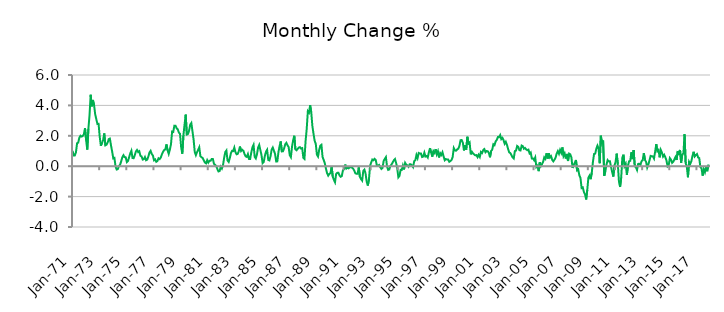
| Category | Series 0 |
|---|---|
| 1971-01-01 | 1.014 |
| 1971-02-01 | 0.711 |
| 1971-03-01 | 0.712 |
| 1971-04-01 | 0.919 |
| 1971-05-01 | 1.51 |
| 1971-06-01 | 1.551 |
| 1971-07-01 | 1.878 |
| 1971-08-01 | 2.005 |
| 1971-09-01 | 1.95 |
| 1971-10-01 | 1.987 |
| 1971-11-01 | 2.104 |
| 1971-12-01 | 2.509 |
| 1972-01-01 | 1.699 |
| 1972-02-01 | 1.094 |
| 1972-03-01 | 2.462 |
| 1972-04-01 | 3.36 |
| 1972-05-01 | 4.697 |
| 1972-06-01 | 3.937 |
| 1972-07-01 | 4.355 |
| 1972-08-01 | 4.026 |
| 1972-09-01 | 3.417 |
| 1972-10-01 | 3.088 |
| 1972-11-01 | 2.774 |
| 1972-12-01 | 2.784 |
| 1973-01-01 | 1.938 |
| 1973-02-01 | 1.343 |
| 1973-03-01 | 1.524 |
| 1973-04-01 | 1.712 |
| 1973-05-01 | 2.158 |
| 1973-06-01 | 1.373 |
| 1973-07-01 | 1.418 |
| 1973-08-01 | 1.551 |
| 1973-09-01 | 1.782 |
| 1973-10-01 | 1.816 |
| 1973-11-01 | 1.359 |
| 1973-12-01 | 0.961 |
| 1974-01-01 | 0.511 |
| 1974-02-01 | 0.548 |
| 1974-03-01 | -0.022 |
| 1974-04-01 | -0.216 |
| 1974-05-01 | -0.191 |
| 1974-06-01 | 0.007 |
| 1974-07-01 | 0.097 |
| 1974-08-01 | 0.326 |
| 1974-09-01 | 0.591 |
| 1974-10-01 | 0.722 |
| 1974-11-01 | 0.594 |
| 1974-12-01 | 0.583 |
| 1975-01-01 | 0.268 |
| 1975-02-01 | 0.337 |
| 1975-03-01 | 0.597 |
| 1975-04-01 | 0.845 |
| 1975-05-01 | 1.017 |
| 1975-06-01 | 0.539 |
| 1975-07-01 | 0.526 |
| 1975-08-01 | 0.722 |
| 1975-09-01 | 0.97 |
| 1975-10-01 | 1.067 |
| 1975-11-01 | 0.93 |
| 1975-12-01 | 0.985 |
| 1976-01-01 | 0.687 |
| 1976-02-01 | 0.643 |
| 1976-03-01 | 0.437 |
| 1976-04-01 | 0.463 |
| 1976-05-01 | 0.603 |
| 1976-06-01 | 0.392 |
| 1976-07-01 | 0.432 |
| 1976-08-01 | 0.636 |
| 1976-09-01 | 0.905 |
| 1976-10-01 | 1.011 |
| 1976-11-01 | 0.8 |
| 1976-12-01 | 0.709 |
| 1977-01-01 | 0.392 |
| 1977-02-01 | 0.448 |
| 1977-03-01 | 0.289 |
| 1977-04-01 | 0.338 |
| 1977-05-01 | 0.521 |
| 1977-06-01 | 0.47 |
| 1977-07-01 | 0.575 |
| 1977-08-01 | 0.784 |
| 1977-09-01 | 0.951 |
| 1977-10-01 | 1.061 |
| 1977-11-01 | 1.111 |
| 1977-12-01 | 1.434 |
| 1978-01-01 | 1.05 |
| 1978-02-01 | 0.811 |
| 1978-03-01 | 1.084 |
| 1978-04-01 | 1.443 |
| 1978-05-01 | 2.28 |
| 1978-06-01 | 2.255 |
| 1978-07-01 | 2.668 |
| 1978-08-01 | 2.665 |
| 1978-09-01 | 2.498 |
| 1978-10-01 | 2.424 |
| 1978-11-01 | 2.207 |
| 1978-12-01 | 2.133 |
| 1979-01-01 | 1.242 |
| 1979-02-01 | 0.823 |
| 1979-03-01 | 2.034 |
| 1979-04-01 | 2.732 |
| 1979-05-01 | 3.394 |
| 1979-06-01 | 2.083 |
| 1979-07-01 | 2.118 |
| 1979-08-01 | 2.335 |
| 1979-09-01 | 2.734 |
| 1979-10-01 | 2.841 |
| 1979-11-01 | 2.3 |
| 1979-12-01 | 1.747 |
| 1980-01-01 | 0.943 |
| 1980-02-01 | 0.726 |
| 1980-03-01 | 0.925 |
| 1980-04-01 | 1.073 |
| 1980-05-01 | 1.242 |
| 1980-06-01 | 0.656 |
| 1980-07-01 | 0.591 |
| 1980-08-01 | 0.543 |
| 1980-09-01 | 0.381 |
| 1980-10-01 | 0.243 |
| 1980-11-01 | 0.186 |
| 1980-12-01 | 0.395 |
| 1981-01-01 | 0.234 |
| 1981-02-01 | 0.354 |
| 1981-03-01 | 0.354 |
| 1981-04-01 | 0.474 |
| 1981-05-01 | 0.478 |
| 1981-06-01 | 0.161 |
| 1981-07-01 | 0.077 |
| 1981-08-01 | 0.019 |
| 1981-09-01 | -0.188 |
| 1981-10-01 | -0.344 |
| 1981-11-01 | -0.317 |
| 1981-12-01 | -0.035 |
| 1982-01-01 | -0.155 |
| 1982-02-01 | 0.068 |
| 1982-03-01 | 0.555 |
| 1982-04-01 | 0.929 |
| 1982-05-01 | 1.031 |
| 1982-06-01 | 0.372 |
| 1982-07-01 | 0.28 |
| 1982-08-01 | 0.532 |
| 1982-09-01 | 0.859 |
| 1982-10-01 | 1.012 |
| 1982-11-01 | 0.998 |
| 1982-12-01 | 1.225 |
| 1983-01-01 | 0.92 |
| 1983-02-01 | 0.783 |
| 1983-03-01 | 0.81 |
| 1983-04-01 | 0.995 |
| 1983-05-01 | 1.293 |
| 1983-06-01 | 1.001 |
| 1983-07-01 | 1.08 |
| 1983-08-01 | 1.015 |
| 1983-09-01 | 0.803 |
| 1983-10-01 | 0.652 |
| 1983-11-01 | 0.611 |
| 1983-12-01 | 0.798 |
| 1984-01-01 | 0.473 |
| 1984-02-01 | 0.478 |
| 1984-03-01 | 0.903 |
| 1984-04-01 | 1.241 |
| 1984-05-01 | 1.404 |
| 1984-06-01 | 0.614 |
| 1984-07-01 | 0.511 |
| 1984-08-01 | 0.774 |
| 1984-09-01 | 1.225 |
| 1984-10-01 | 1.401 |
| 1984-11-01 | 1.068 |
| 1984-12-01 | 0.734 |
| 1985-01-01 | 0.202 |
| 1985-02-01 | 0.279 |
| 1985-03-01 | 0.684 |
| 1985-04-01 | 0.954 |
| 1985-05-01 | 1.079 |
| 1985-06-01 | 0.413 |
| 1985-07-01 | 0.38 |
| 1985-08-01 | 0.656 |
| 1985-09-01 | 1.087 |
| 1985-10-01 | 1.228 |
| 1985-11-01 | 1.02 |
| 1985-12-01 | 0.807 |
| 1986-01-01 | 0.311 |
| 1986-02-01 | 0.317 |
| 1986-03-01 | 0.923 |
| 1986-04-01 | 1.322 |
| 1986-05-01 | 1.629 |
| 1986-06-01 | 0.97 |
| 1986-07-01 | 0.982 |
| 1986-08-01 | 1.161 |
| 1986-09-01 | 1.443 |
| 1986-10-01 | 1.536 |
| 1986-11-01 | 1.373 |
| 1986-12-01 | 1.263 |
| 1987-01-01 | 0.724 |
| 1987-02-01 | 0.595 |
| 1987-03-01 | 1.283 |
| 1987-04-01 | 1.705 |
| 1987-05-01 | 2.003 |
| 1987-06-01 | 1.108 |
| 1987-07-01 | 1.049 |
| 1987-08-01 | 1.142 |
| 1987-09-01 | 1.226 |
| 1987-10-01 | 1.253 |
| 1987-11-01 | 1.16 |
| 1987-12-01 | 1.188 |
| 1988-01-01 | 0.558 |
| 1988-02-01 | 0.478 |
| 1988-03-01 | 1.666 |
| 1988-04-01 | 2.466 |
| 1988-05-01 | 3.62 |
| 1988-06-01 | 3.526 |
| 1988-07-01 | 4.01 |
| 1988-08-01 | 3.546 |
| 1988-09-01 | 2.637 |
| 1988-10-01 | 2.133 |
| 1988-11-01 | 1.68 |
| 1988-12-01 | 1.467 |
| 1989-01-01 | 0.756 |
| 1989-02-01 | 0.634 |
| 1989-03-01 | 1.069 |
| 1989-04-01 | 1.347 |
| 1989-05-01 | 1.408 |
| 1989-06-01 | 0.607 |
| 1989-07-01 | 0.411 |
| 1989-08-01 | 0.192 |
| 1989-09-01 | -0.165 |
| 1989-10-01 | -0.462 |
| 1989-11-01 | -0.618 |
| 1989-12-01 | -0.507 |
| 1990-01-01 | -0.459 |
| 1990-02-01 | -0.019 |
| 1990-03-01 | -0.686 |
| 1990-04-01 | -0.897 |
| 1990-05-01 | -1.058 |
| 1990-06-01 | -0.51 |
| 1990-07-01 | -0.437 |
| 1990-08-01 | -0.428 |
| 1990-09-01 | -0.604 |
| 1990-10-01 | -0.695 |
| 1990-11-01 | -0.649 |
| 1990-12-01 | -0.278 |
| 1991-01-01 | -0.196 |
| 1991-02-01 | 0.105 |
| 1991-03-01 | -0.159 |
| 1991-04-01 | -0.105 |
| 1991-05-01 | -0.139 |
| 1991-06-01 | -0.062 |
| 1991-07-01 | -0.066 |
| 1991-08-01 | -0.093 |
| 1991-09-01 | -0.159 |
| 1991-10-01 | -0.285 |
| 1991-11-01 | -0.467 |
| 1991-12-01 | -0.497 |
| 1992-01-01 | -0.494 |
| 1992-02-01 | -0.076 |
| 1992-03-01 | -0.697 |
| 1992-04-01 | -0.848 |
| 1992-05-01 | -0.944 |
| 1992-06-01 | -0.312 |
| 1992-07-01 | -0.225 |
| 1992-08-01 | -0.473 |
| 1992-09-01 | -1.015 |
| 1992-10-01 | -1.272 |
| 1992-11-01 | -0.873 |
| 1992-12-01 | 0.026 |
| 1993-01-01 | 0.247 |
| 1993-02-01 | 0.437 |
| 1993-03-01 | 0.391 |
| 1993-04-01 | 0.487 |
| 1993-05-01 | 0.413 |
| 1993-06-01 | 0.047 |
| 1993-07-01 | 0.03 |
| 1993-08-01 | 0.082 |
| 1993-09-01 | -0.063 |
| 1993-10-01 | -0.18 |
| 1993-11-01 | -0.118 |
| 1993-12-01 | 0.35 |
| 1994-01-01 | 0.48 |
| 1994-02-01 | 0.595 |
| 1994-03-01 | -0.023 |
| 1994-04-01 | -0.241 |
| 1994-05-01 | -0.212 |
| 1994-06-01 | 0.019 |
| 1994-07-01 | 0.12 |
| 1994-08-01 | 0.247 |
| 1994-09-01 | 0.391 |
| 1994-10-01 | 0.472 |
| 1994-11-01 | 0.222 |
| 1994-12-01 | -0.131 |
| 1995-01-01 | -0.733 |
| 1995-02-01 | -0.635 |
| 1995-03-01 | -0.24 |
| 1995-04-01 | -0.251 |
| 1995-05-01 | 0.043 |
| 1995-06-01 | -0.212 |
| 1995-07-01 | 0.218 |
| 1995-08-01 | 0.097 |
| 1995-09-01 | 0.057 |
| 1995-10-01 | -0.036 |
| 1995-11-01 | 0.126 |
| 1995-12-01 | 0.123 |
| 1996-01-01 | 0.036 |
| 1996-02-01 | -0.061 |
| 1996-03-01 | 0.33 |
| 1996-04-01 | 0.389 |
| 1996-05-01 | 0.736 |
| 1996-06-01 | 0.535 |
| 1996-07-01 | 0.868 |
| 1996-08-01 | 0.833 |
| 1996-09-01 | 0.834 |
| 1996-10-01 | 0.603 |
| 1996-11-01 | 0.635 |
| 1996-12-01 | 0.892 |
| 1997-01-01 | 0.634 |
| 1997-02-01 | 0.672 |
| 1997-03-01 | 0.57 |
| 1997-04-01 | 0.919 |
| 1997-05-01 | 1.19 |
| 1997-06-01 | 0.893 |
| 1997-07-01 | 0.625 |
| 1997-08-01 | 0.99 |
| 1997-09-01 | 0.877 |
| 1997-10-01 | 1.126 |
| 1997-11-01 | 0.779 |
| 1997-12-01 | 0.981 |
| 1998-01-01 | 0.576 |
| 1998-02-01 | 0.861 |
| 1998-03-01 | 0.744 |
| 1998-04-01 | 0.917 |
| 1998-05-01 | 0.646 |
| 1998-06-01 | 0.394 |
| 1998-07-01 | 0.47 |
| 1998-08-01 | 0.438 |
| 1998-09-01 | 0.441 |
| 1998-10-01 | 0.291 |
| 1998-11-01 | 0.339 |
| 1998-12-01 | 0.406 |
| 1999-01-01 | 0.599 |
| 1999-02-01 | 1.189 |
| 1999-03-01 | 1.036 |
| 1999-04-01 | 1.017 |
| 1999-05-01 | 1.102 |
| 1999-06-01 | 1.154 |
| 1999-07-01 | 1.343 |
| 1999-08-01 | 1.715 |
| 1999-09-01 | 1.719 |
| 1999-10-01 | 1.552 |
| 1999-11-01 | 1.038 |
| 1999-12-01 | 1.38 |
| 2000-01-01 | 1.085 |
| 2000-02-01 | 1.936 |
| 2000-03-01 | 1.491 |
| 2000-04-01 | 1.566 |
| 2000-05-01 | 0.781 |
| 2000-06-01 | 0.949 |
| 2000-07-01 | 0.839 |
| 2000-08-01 | 0.775 |
| 2000-09-01 | 0.714 |
| 2000-10-01 | 0.729 |
| 2000-11-01 | 0.596 |
| 2000-12-01 | 0.754 |
| 2001-01-01 | 0.606 |
| 2001-02-01 | 0.935 |
| 2001-03-01 | 0.867 |
| 2001-04-01 | 1.055 |
| 2001-05-01 | 1.127 |
| 2001-06-01 | 0.924 |
| 2001-07-01 | 0.998 |
| 2001-08-01 | 0.985 |
| 2001-09-01 | 0.883 |
| 2001-10-01 | 0.588 |
| 2001-11-01 | 0.997 |
| 2001-12-01 | 1.094 |
| 2002-01-01 | 1.445 |
| 2002-02-01 | 1.384 |
| 2002-03-01 | 1.631 |
| 2002-04-01 | 1.728 |
| 2002-05-01 | 1.918 |
| 2002-06-01 | 1.906 |
| 2002-07-01 | 2.048 |
| 2002-08-01 | 1.783 |
| 2002-09-01 | 1.859 |
| 2002-10-01 | 1.71 |
| 2002-11-01 | 1.477 |
| 2002-12-01 | 1.602 |
| 2003-01-01 | 1.407 |
| 2003-02-01 | 1.139 |
| 2003-03-01 | 0.91 |
| 2003-04-01 | 0.863 |
| 2003-05-01 | 0.726 |
| 2003-06-01 | 0.579 |
| 2003-07-01 | 0.508 |
| 2003-08-01 | 0.993 |
| 2003-09-01 | 1.027 |
| 2003-10-01 | 1.329 |
| 2003-11-01 | 1.273 |
| 2003-12-01 | 1.053 |
| 2004-01-01 | 1.036 |
| 2004-02-01 | 1.359 |
| 2004-03-01 | 1.319 |
| 2004-04-01 | 1.15 |
| 2004-05-01 | 1.201 |
| 2004-06-01 | 1.108 |
| 2004-07-01 | 1.051 |
| 2004-08-01 | 1.089 |
| 2004-09-01 | 0.842 |
| 2004-10-01 | 0.907 |
| 2004-11-01 | 0.505 |
| 2004-12-01 | 0.511 |
| 2005-01-01 | 0.398 |
| 2005-02-01 | 0.571 |
| 2005-03-01 | -0.049 |
| 2005-04-01 | 0.032 |
| 2005-05-01 | -0.325 |
| 2005-06-01 | 0.259 |
| 2005-07-01 | 0.002 |
| 2005-08-01 | 0.136 |
| 2005-09-01 | 0.293 |
| 2005-10-01 | 0.583 |
| 2005-11-01 | 0.486 |
| 2005-12-01 | 0.852 |
| 2006-01-01 | 0.504 |
| 2006-02-01 | 0.847 |
| 2006-03-01 | 0.574 |
| 2006-04-01 | 0.658 |
| 2006-05-01 | 0.417 |
| 2006-06-01 | 0.318 |
| 2006-07-01 | 0.428 |
| 2006-08-01 | 0.567 |
| 2006-09-01 | 0.838 |
| 2006-10-01 | 0.991 |
| 2006-11-01 | 0.814 |
| 2006-12-01 | 1.073 |
| 2007-01-01 | 0.89 |
| 2007-02-01 | 1.238 |
| 2007-03-01 | 0.672 |
| 2007-04-01 | 0.843 |
| 2007-05-01 | 0.507 |
| 2007-06-01 | 0.806 |
| 2007-07-01 | 0.341 |
| 2007-08-01 | 0.825 |
| 2007-09-01 | 0.776 |
| 2007-10-01 | 0.57 |
| 2007-11-01 | -0.115 |
| 2007-12-01 | 0.093 |
| 2008-01-01 | 0.224 |
| 2008-02-01 | 0.41 |
| 2008-03-01 | -0.272 |
| 2008-04-01 | -0.209 |
| 2008-05-01 | -0.6 |
| 2008-06-01 | -0.774 |
| 2008-07-01 | -1.438 |
| 2008-08-01 | -1.396 |
| 2008-09-01 | -1.689 |
| 2008-10-01 | -1.838 |
| 2008-11-01 | -2.187 |
| 2008-12-01 | -1.566 |
| 2009-01-01 | -0.751 |
| 2009-02-01 | -0.62 |
| 2009-03-01 | -0.854 |
| 2009-04-01 | -0.417 |
| 2009-05-01 | 0.276 |
| 2009-06-01 | 0.804 |
| 2009-07-01 | 0.826 |
| 2009-08-01 | 1.14 |
| 2009-09-01 | 1.356 |
| 2009-10-01 | 1.173 |
| 2009-11-01 | 0.2 |
| 2009-12-01 | 2.008 |
| 2010-01-01 | 1.536 |
| 2010-02-01 | 1.696 |
| 2010-03-01 | -0.634 |
| 2010-04-01 | -0.334 |
| 2010-05-01 | 0.108 |
| 2010-06-01 | 0.402 |
| 2010-07-01 | 0.318 |
| 2010-08-01 | 0.328 |
| 2010-09-01 | -0.044 |
| 2010-10-01 | -0.375 |
| 2010-11-01 | -0.683 |
| 2010-12-01 | 0.039 |
| 2011-01-01 | 0.267 |
| 2011-02-01 | 0.826 |
| 2011-03-01 | 0.158 |
| 2011-04-01 | -1.001 |
| 2011-05-01 | -1.364 |
| 2011-06-01 | -0.754 |
| 2011-07-01 | 0.56 |
| 2011-08-01 | 0.758 |
| 2011-09-01 | 0.004 |
| 2011-10-01 | 0.147 |
| 2011-11-01 | -0.577 |
| 2011-12-01 | 0.045 |
| 2012-01-01 | 0.327 |
| 2012-02-01 | 0.353 |
| 2012-03-01 | 0.915 |
| 2012-04-01 | 0.467 |
| 2012-05-01 | 1.056 |
| 2012-06-01 | 0.009 |
| 2012-07-01 | -0.075 |
| 2012-08-01 | -0.251 |
| 2012-09-01 | 0.151 |
| 2012-10-01 | 0.163 |
| 2012-11-01 | 0.087 |
| 2012-12-01 | 0.326 |
| 2013-01-01 | 0.396 |
| 2013-02-01 | 0.863 |
| 2013-03-01 | 0.42 |
| 2013-04-01 | 0.275 |
| 2013-05-01 | -0.091 |
| 2013-06-01 | 0.108 |
| 2013-07-01 | 0.378 |
| 2013-08-01 | 0.676 |
| 2013-09-01 | 0.651 |
| 2013-10-01 | 0.645 |
| 2013-11-01 | 0.504 |
| 2013-12-01 | 0.954 |
| 2014-01-01 | 1.451 |
| 2014-02-01 | 0.982 |
| 2014-03-01 | 1.067 |
| 2014-04-01 | 0.586 |
| 2014-05-01 | 1.071 |
| 2014-06-01 | 0.899 |
| 2014-07-01 | 0.632 |
| 2014-08-01 | 0.75 |
| 2014-09-01 | 0.589 |
| 2014-10-01 | 0.384 |
| 2014-11-01 | -0.007 |
| 2014-12-01 | 0.065 |
| 2015-01-01 | 0.533 |
| 2015-02-01 | 0.431 |
| 2015-03-01 | 0.224 |
| 2015-04-01 | 0.295 |
| 2015-05-01 | 0.445 |
| 2015-06-01 | 0.604 |
| 2015-07-01 | 0.411 |
| 2015-08-01 | 1.001 |
| 2015-09-01 | 0.75 |
| 2015-10-01 | 1.069 |
| 2015-11-01 | 0.232 |
| 2015-12-01 | 0.775 |
| 2016-01-01 | 0.836 |
| 2016-02-01 | 2.097 |
| 2016-03-01 | 0.194 |
| 2016-04-01 | -0.036 |
| 2016-05-01 | -0.729 |
| 2016-06-01 | 0.285 |
| 2016-07-01 | 0.147 |
| 2016-08-01 | 0.327 |
| 2016-09-01 | 0.666 |
| 2016-10-01 | 0.947 |
| 2016-11-01 | 0.639 |
| 2016-12-01 | 0.737 |
| 2017-01-01 | 0.801 |
| 2017-02-01 | 0.576 |
| 2017-03-01 | 0.534 |
| 2017-04-01 | -0.058 |
| 2017-05-01 | -0.13 |
| 2017-06-01 | -0.621 |
| 2017-07-01 | -0.204 |
| 2017-08-01 | -0.398 |
| 2017-09-01 | -0.053 |
| 2017-10-01 | -0.331 |
| 2017-11-01 | 0.048 |
| 2017-12-01 | 0.03 |